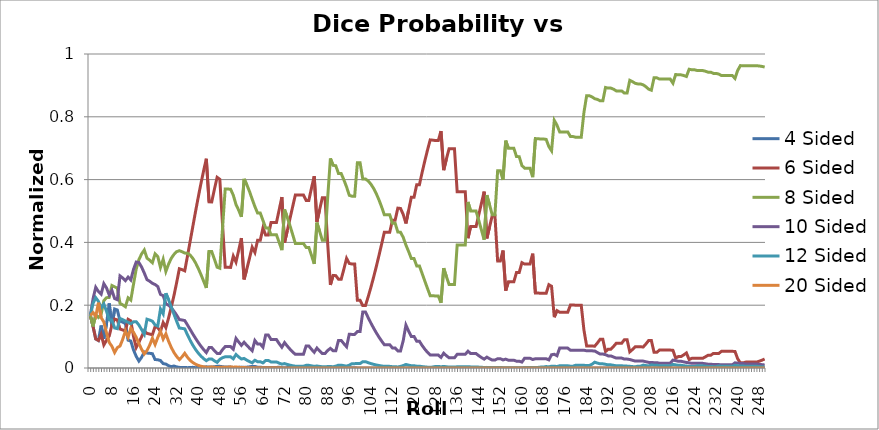
| Category | 4 Sided | 6 Sided | 8 Sided | 10 Sided | 12 Sided | 20 Sided |
|---|---|---|---|---|---|---|
| 0.0 | 0.167 | 0.167 | 0.167 | 0.167 | 0.167 | 0.167 |
| 1.0 | 0.132 | 0.132 | 0.132 | 0.221 | 0.206 | 0.176 |
| 2.0 | 0.093 | 0.093 | 0.17 | 0.257 | 0.224 | 0.164 |
| 3.0 | 0.088 | 0.088 | 0.161 | 0.244 | 0.212 | 0.208 |
| 4.0 | 0.135 | 0.107 | 0.171 | 0.235 | 0.191 | 0.16 |
| 5.0 | 0.093 | 0.073 | 0.215 | 0.269 | 0.204 | 0.147 |
| 6.0 | 0.141 | 0.088 | 0.224 | 0.255 | 0.181 | 0.111 |
| 7.0 | 0.206 | 0.102 | 0.225 | 0.233 | 0.154 | 0.081 |
| 8.0 | 0.131 | 0.137 | 0.263 | 0.247 | 0.152 | 0.069 |
| 9.0 | 0.188 | 0.156 | 0.259 | 0.221 | 0.127 | 0.049 |
| 10.0 | 0.185 | 0.153 | 0.254 | 0.218 | 0.125 | 0.065 |
| 11.0 | 0.149 | 0.124 | 0.206 | 0.293 | 0.158 | 0.07 |
| 12.0 | 0.146 | 0.121 | 0.201 | 0.287 | 0.154 | 0.091 |
| 13.0 | 0.142 | 0.118 | 0.195 | 0.278 | 0.149 | 0.118 |
| 14.0 | 0.089 | 0.155 | 0.223 | 0.29 | 0.145 | 0.098 |
| 15.0 | 0.086 | 0.15 | 0.216 | 0.28 | 0.141 | 0.127 |
| 16.0 | 0.058 | 0.101 | 0.267 | 0.314 | 0.147 | 0.114 |
| 17.0 | 0.037 | 0.065 | 0.315 | 0.337 | 0.147 | 0.098 |
| 18.0 | 0.022 | 0.082 | 0.345 | 0.336 | 0.137 | 0.078 |
| 19.0 | 0.034 | 0.099 | 0.363 | 0.321 | 0.122 | 0.06 |
| 20.0 | 0.051 | 0.118 | 0.376 | 0.302 | 0.107 | 0.045 |
| 21.0 | 0.048 | 0.11 | 0.35 | 0.281 | 0.156 | 0.056 |
| 22.0 | 0.047 | 0.108 | 0.343 | 0.276 | 0.153 | 0.073 |
| 23.0 | 0.046 | 0.106 | 0.335 | 0.27 | 0.149 | 0.095 |
| 24.0 | 0.027 | 0.132 | 0.363 | 0.266 | 0.137 | 0.075 |
| 25.0 | 0.026 | 0.129 | 0.355 | 0.259 | 0.134 | 0.097 |
| 26.0 | 0.024 | 0.116 | 0.32 | 0.234 | 0.188 | 0.117 |
| 27.0 | 0.014 | 0.145 | 0.346 | 0.23 | 0.172 | 0.092 |
| 28.0 | 0.012 | 0.128 | 0.307 | 0.204 | 0.238 | 0.109 |
| 29.0 | 0.007 | 0.159 | 0.331 | 0.2 | 0.217 | 0.085 |
| 30.0 | 0.004 | 0.194 | 0.35 | 0.192 | 0.195 | 0.066 |
| 31.0 | 0.006 | 0.231 | 0.362 | 0.181 | 0.171 | 0.049 |
| 32.0 | 0.004 | 0.272 | 0.37 | 0.168 | 0.149 | 0.037 |
| 33.0 | 0.002 | 0.316 | 0.374 | 0.154 | 0.127 | 0.027 |
| 34.0 | 0.002 | 0.313 | 0.37 | 0.153 | 0.126 | 0.036 |
| 35.0 | 0.002 | 0.31 | 0.366 | 0.151 | 0.125 | 0.047 |
| 36.0 | 0.001 | 0.356 | 0.366 | 0.137 | 0.106 | 0.034 |
| 37.0 | 0.001 | 0.403 | 0.36 | 0.123 | 0.088 | 0.024 |
| 38.0 | 0.002 | 0.451 | 0.349 | 0.108 | 0.073 | 0.017 |
| 39.0 | 0.001 | 0.498 | 0.335 | 0.094 | 0.059 | 0.012 |
| 40.0 | 0.002 | 0.544 | 0.317 | 0.081 | 0.048 | 0.008 |
| 41.0 | 0.002 | 0.587 | 0.298 | 0.069 | 0.038 | 0.006 |
| 42.0 | 0.003 | 0.628 | 0.277 | 0.059 | 0.03 | 0.004 |
| 43.0 | 0.004 | 0.666 | 0.255 | 0.049 | 0.023 | 0.003 |
| 44.0 | 0.003 | 0.529 | 0.371 | 0.065 | 0.029 | 0.003 |
| 45.0 | 0.003 | 0.529 | 0.371 | 0.065 | 0.029 | 0.004 |
| 46.0 | 0.004 | 0.569 | 0.346 | 0.055 | 0.023 | 0.002 |
| 47.0 | 0.005 | 0.607 | 0.321 | 0.046 | 0.018 | 0.002 |
| 48.0 | 0.005 | 0.601 | 0.318 | 0.046 | 0.028 | 0.002 |
| 49.0 | 0.004 | 0.458 | 0.444 | 0.058 | 0.033 | 0.002 |
| 50.0 | 0.003 | 0.321 | 0.57 | 0.068 | 0.036 | 0.002 |
| 51.0 | 0.003 | 0.321 | 0.57 | 0.068 | 0.036 | 0.003 |
| 52.0 | 0.003 | 0.32 | 0.569 | 0.068 | 0.036 | 0.004 |
| 53.0 | 0.002 | 0.357 | 0.55 | 0.06 | 0.029 | 0.003 |
| 54.0 | 0.001 | 0.337 | 0.521 | 0.094 | 0.043 | 0.003 |
| 55.0 | 0.002 | 0.375 | 0.503 | 0.083 | 0.035 | 0.002 |
| 56.0 | 0.003 | 0.414 | 0.481 | 0.072 | 0.029 | 0.002 |
| 57.0 | 0.002 | 0.282 | 0.602 | 0.082 | 0.03 | 0.001 |
| 58.0 | 0.003 | 0.315 | 0.584 | 0.072 | 0.025 | 0.001 |
| 59.0 | 0.004 | 0.349 | 0.562 | 0.063 | 0.02 | 0.001 |
| 60.0 | 0.005 | 0.385 | 0.538 | 0.055 | 0.017 | 0 |
| 61.0 | 0.005 | 0.368 | 0.514 | 0.088 | 0.025 | 0.001 |
| 62.0 | 0.003 | 0.407 | 0.494 | 0.076 | 0.02 | 0 |
| 63.0 | 0.003 | 0.407 | 0.494 | 0.076 | 0.02 | 0.001 |
| 64.0 | 0.001 | 0.446 | 0.47 | 0.066 | 0.016 | 0 |
| 65.0 | 0.001 | 0.423 | 0.446 | 0.105 | 0.024 | 0.001 |
| 66.0 | 0.001 | 0.423 | 0.446 | 0.105 | 0.024 | 0.001 |
| 67.0 | 0.002 | 0.464 | 0.424 | 0.091 | 0.019 | 0 |
| 68.0 | 0.002 | 0.464 | 0.424 | 0.091 | 0.019 | 0.001 |
| 69.0 | 0.002 | 0.463 | 0.424 | 0.091 | 0.019 | 0.001 |
| 70.0 | 0.002 | 0.504 | 0.4 | 0.078 | 0.015 | 0.001 |
| 71.0 | 0.001 | 0.544 | 0.376 | 0.066 | 0.012 | 0 |
| 72.0 | 0.001 | 0.399 | 0.505 | 0.081 | 0.014 | 0 |
| 73.0 | 0.001 | 0.437 | 0.48 | 0.07 | 0.011 | 0 |
| 74.0 | 0.002 | 0.475 | 0.454 | 0.06 | 0.009 | 0 |
| 75.0 | 0.002 | 0.513 | 0.426 | 0.051 | 0.007 | 0 |
| 76.0 | 0.003 | 0.551 | 0.397 | 0.043 | 0.006 | 0 |
| 77.0 | 0.003 | 0.551 | 0.397 | 0.043 | 0.006 | 0 |
| 78.0 | 0.003 | 0.551 | 0.396 | 0.043 | 0.006 | 0 |
| 79.0 | 0.003 | 0.551 | 0.396 | 0.043 | 0.006 | 0 |
| 80.0 | 0.003 | 0.534 | 0.384 | 0.07 | 0.009 | 0 |
| 81.0 | 0.003 | 0.534 | 0.384 | 0.07 | 0.009 | 0 |
| 82.0 | 0.002 | 0.573 | 0.358 | 0.059 | 0.007 | 0 |
| 83.0 | 0.002 | 0.611 | 0.332 | 0.05 | 0.005 | 0 |
| 84.0 | 0.002 | 0.465 | 0.463 | 0.064 | 0.006 | 0 |
| 85.0 | 0.001 | 0.504 | 0.436 | 0.054 | 0.005 | 0 |
| 86.0 | 0.001 | 0.542 | 0.407 | 0.046 | 0.004 | 0 |
| 87.0 | 0.001 | 0.542 | 0.407 | 0.046 | 0.004 | 0 |
| 88.0 | 0.001 | 0.395 | 0.543 | 0.056 | 0.005 | 0 |
| 89.0 | 0.001 | 0.265 | 0.667 | 0.063 | 0.005 | 0 |
| 90.0 | 0.001 | 0.295 | 0.646 | 0.055 | 0.004 | 0 |
| 91.0 | 0.001 | 0.294 | 0.644 | 0.055 | 0.006 | 0 |
| 92.0 | 0.001 | 0.283 | 0.619 | 0.088 | 0.009 | 0 |
| 93.0 | 0.001 | 0.283 | 0.619 | 0.088 | 0.009 | 0 |
| 94.0 | 0.001 | 0.315 | 0.599 | 0.077 | 0.007 | 0 |
| 95.0 | 0.001 | 0.349 | 0.577 | 0.068 | 0.006 | 0 |
| 96.0 | 0.001 | 0.333 | 0.55 | 0.108 | 0.009 | 0 |
| 97.0 | 0.001 | 0.331 | 0.547 | 0.107 | 0.014 | 0 |
| 98.0 | 0.001 | 0.331 | 0.547 | 0.107 | 0.014 | 0 |
| 99.0 | 0 | 0.216 | 0.653 | 0.116 | 0.014 | 0 |
| 100.0 | 0 | 0.216 | 0.653 | 0.116 | 0.014 | 0 |
| 101.0 | 0 | 0.199 | 0.602 | 0.178 | 0.02 | 0 |
| 102.0 | 0 | 0.199 | 0.602 | 0.178 | 0.02 | 0 |
| 103.0 | 0 | 0.227 | 0.596 | 0.16 | 0.017 | 0 |
| 104.0 | 0 | 0.256 | 0.586 | 0.143 | 0.014 | 0 |
| 105.0 | 0 | 0.288 | 0.572 | 0.127 | 0.012 | 0 |
| 106.0 | 0 | 0.322 | 0.555 | 0.112 | 0.01 | 0 |
| 107.0 | 0 | 0.358 | 0.535 | 0.099 | 0.008 | 0 |
| 108.0 | 0 | 0.395 | 0.513 | 0.086 | 0.006 | 0 |
| 109.0 | 0 | 0.433 | 0.488 | 0.074 | 0.005 | 0 |
| 110.0 | 0 | 0.433 | 0.488 | 0.074 | 0.005 | 0 |
| 111.0 | 0 | 0.433 | 0.488 | 0.074 | 0.005 | 0 |
| 112.0 | 0 | 0.471 | 0.461 | 0.064 | 0.004 | 0 |
| 113.0 | 0 | 0.471 | 0.461 | 0.064 | 0.004 | 0 |
| 114.0 | 0 | 0.509 | 0.433 | 0.054 | 0.003 | 0 |
| 115.0 | 0 | 0.508 | 0.432 | 0.054 | 0.005 | 0 |
| 116.0 | 0 | 0.489 | 0.416 | 0.087 | 0.008 | 0 |
| 117.0 | 0 | 0.46 | 0.392 | 0.137 | 0.011 | 0 |
| 118.0 | 0 | 0.502 | 0.371 | 0.118 | 0.009 | 0 |
| 119.0 | 0 | 0.543 | 0.349 | 0.101 | 0.007 | 0 |
| 120.0 | 0 | 0.543 | 0.349 | 0.101 | 0.007 | 0 |
| 121.0 | 0 | 0.584 | 0.325 | 0.085 | 0.006 | 0 |
| 122.0 | 0 | 0.584 | 0.325 | 0.085 | 0.006 | 0 |
| 123.0 | 0 | 0.622 | 0.301 | 0.072 | 0.004 | 0 |
| 124.0 | 0 | 0.659 | 0.277 | 0.06 | 0.004 | 0 |
| 125.0 | 0 | 0.694 | 0.253 | 0.05 | 0.003 | 0 |
| 126.0 | 0 | 0.726 | 0.23 | 0.041 | 0.002 | 0 |
| 127.0 | 0 | 0.726 | 0.23 | 0.041 | 0.003 | 0 |
| 128.0 | 0 | 0.724 | 0.23 | 0.041 | 0.005 | 0 |
| 129.0 | 0 | 0.724 | 0.229 | 0.041 | 0.005 | 0 |
| 130.0 | 0 | 0.755 | 0.208 | 0.034 | 0.004 | 0 |
| 131.0 | 0 | 0.63 | 0.318 | 0.047 | 0.005 | 0 |
| 132.0 | 0 | 0.665 | 0.291 | 0.039 | 0.004 | 0 |
| 133.0 | 0 | 0.699 | 0.266 | 0.033 | 0.003 | 0 |
| 134.0 | 0 | 0.699 | 0.266 | 0.033 | 0.003 | 0 |
| 135.0 | 0 | 0.699 | 0.266 | 0.033 | 0.003 | 0 |
| 136.0 | 0 | 0.561 | 0.391 | 0.044 | 0.004 | 0 |
| 137.0 | 0 | 0.561 | 0.391 | 0.044 | 0.004 | 0 |
| 138.0 | 0 | 0.561 | 0.391 | 0.044 | 0.004 | 0 |
| 139.0 | 0 | 0.561 | 0.391 | 0.044 | 0.004 | 0 |
| 140.0 | 0 | 0.413 | 0.529 | 0.053 | 0.004 | 0 |
| 141.0 | 0 | 0.45 | 0.5 | 0.046 | 0.003 | 0 |
| 142.0 | 0 | 0.45 | 0.5 | 0.046 | 0.003 | 0 |
| 143.0 | 0 | 0.45 | 0.5 | 0.046 | 0.003 | 0 |
| 144.0 | 0 | 0.488 | 0.47 | 0.039 | 0.003 | 0 |
| 145.0 | 0 | 0.525 | 0.44 | 0.033 | 0.002 | 0 |
| 146.0 | 0 | 0.562 | 0.408 | 0.028 | 0.002 | 0 |
| 147.0 | 0 | 0.413 | 0.551 | 0.035 | 0.002 | 0 |
| 148.0 | 0 | 0.449 | 0.52 | 0.03 | 0.002 | 0 |
| 149.0 | 0 | 0.485 | 0.488 | 0.025 | 0.001 | 0 |
| 150.0 | 0 | 0.485 | 0.488 | 0.025 | 0.001 | 0 |
| 151.0 | 0 | 0.341 | 0.628 | 0.03 | 0.001 | 0 |
| 152.0 | 0 | 0.341 | 0.628 | 0.03 | 0.001 | 0 |
| 153.0 | 0 | 0.374 | 0.599 | 0.026 | 0.001 | 0 |
| 154.0 | 0 | 0.247 | 0.724 | 0.028 | 0.001 | 0 |
| 155.0 | 0 | 0.275 | 0.7 | 0.025 | 0.001 | 0 |
| 156.0 | 0 | 0.275 | 0.7 | 0.025 | 0.001 | 0 |
| 157.0 | 0 | 0.275 | 0.7 | 0.025 | 0.001 | 0 |
| 158.0 | 0 | 0.304 | 0.673 | 0.022 | 0.001 | 0 |
| 159.0 | 0 | 0.304 | 0.673 | 0.022 | 0.001 | 0 |
| 160.0 | 0 | 0.335 | 0.645 | 0.019 | 0.001 | 0 |
| 161.0 | 0 | 0.331 | 0.636 | 0.031 | 0.001 | 0 |
| 162.0 | 0 | 0.331 | 0.636 | 0.031 | 0.001 | 0 |
| 163.0 | 0 | 0.331 | 0.636 | 0.031 | 0.001 | 0 |
| 164.0 | 0 | 0.364 | 0.608 | 0.027 | 0.001 | 0 |
| 165.0 | 0 | 0.239 | 0.731 | 0.029 | 0.001 | 0 |
| 166.0 | 0 | 0.239 | 0.73 | 0.029 | 0.002 | 0 |
| 167.0 | 0 | 0.238 | 0.729 | 0.029 | 0.003 | 0 |
| 168.0 | 0 | 0.238 | 0.729 | 0.029 | 0.003 | 0 |
| 169.0 | 0 | 0.238 | 0.728 | 0.029 | 0.005 | 0 |
| 170.0 | 0 | 0.265 | 0.705 | 0.026 | 0.004 | 0 |
| 171.0 | 0 | 0.26 | 0.692 | 0.042 | 0.006 | 0 |
| 172.0 | 0 | 0.162 | 0.789 | 0.044 | 0.006 | 0 |
| 173.0 | 0 | 0.183 | 0.773 | 0.039 | 0.005 | 0 |
| 174.0 | 0 | 0.178 | 0.752 | 0.063 | 0.007 | 0 |
| 175.0 | 0 | 0.178 | 0.752 | 0.063 | 0.007 | 0 |
| 176.0 | 0 | 0.178 | 0.752 | 0.063 | 0.007 | 0 |
| 177.0 | 0 | 0.178 | 0.752 | 0.063 | 0.007 | 0 |
| 178.0 | 0 | 0.201 | 0.737 | 0.056 | 0.006 | 0 |
| 179.0 | 0 | 0.201 | 0.737 | 0.056 | 0.006 | 0 |
| 180.0 | 0 | 0.2 | 0.735 | 0.056 | 0.009 | 0 |
| 181.0 | 0 | 0.2 | 0.735 | 0.056 | 0.009 | 0 |
| 182.0 | 0 | 0.2 | 0.735 | 0.056 | 0.009 | 0 |
| 183.0 | 0 | 0.121 | 0.814 | 0.057 | 0.009 | 0 |
| 184.0 | 0 | 0.07 | 0.867 | 0.055 | 0.008 | 0 |
| 185.0 | 0 | 0.07 | 0.867 | 0.055 | 0.008 | 0 |
| 186.0 | 0 | 0.07 | 0.863 | 0.055 | 0.012 | 0 |
| 187.0 | 0 | 0.069 | 0.858 | 0.054 | 0.019 | 0 |
| 188.0 | 0 | 0.08 | 0.855 | 0.049 | 0.016 | 0 |
| 189.0 | 0 | 0.091 | 0.851 | 0.044 | 0.013 | 0 |
| 190.0 | 0 | 0.091 | 0.851 | 0.044 | 0.013 | 0 |
| 191.0 | 0 | 0.052 | 0.893 | 0.042 | 0.012 | 0 |
| 192.0 | 0 | 0.06 | 0.891 | 0.039 | 0.01 | 0 |
| 193.0 | 0 | 0.06 | 0.891 | 0.039 | 0.01 | 0 |
| 194.0 | 0 | 0.069 | 0.888 | 0.035 | 0.008 | 0 |
| 195.0 | 0 | 0.079 | 0.882 | 0.032 | 0.007 | 0 |
| 196.0 | 0 | 0.079 | 0.882 | 0.032 | 0.007 | 0 |
| 197.0 | 0 | 0.079 | 0.882 | 0.032 | 0.007 | 0 |
| 198.0 | 0 | 0.09 | 0.875 | 0.028 | 0.006 | 0 |
| 199.0 | 0 | 0.09 | 0.875 | 0.028 | 0.006 | 0 |
| 200.0 | 0 | 0.051 | 0.916 | 0.027 | 0.005 | 0 |
| 201.0 | 0 | 0.059 | 0.912 | 0.024 | 0.005 | 0 |
| 202.0 | 0 | 0.068 | 0.907 | 0.022 | 0.004 | 0 |
| 203.0 | 0 | 0.067 | 0.905 | 0.022 | 0.006 | 0 |
| 204.0 | 0 | 0.067 | 0.905 | 0.022 | 0.006 | 0 |
| 205.0 | 0 | 0.067 | 0.902 | 0.022 | 0.009 | 0 |
| 206.0 | 0 | 0.077 | 0.896 | 0.02 | 0.008 | 0 |
| 207.0 | 0 | 0.088 | 0.888 | 0.018 | 0.006 | 0 |
| 208.0 | 0 | 0.087 | 0.885 | 0.018 | 0.01 | 0 |
| 209.0 | 0 | 0.05 | 0.924 | 0.017 | 0.009 | 0 |
| 210.0 | 0 | 0.05 | 0.924 | 0.017 | 0.009 | 0 |
| 211.0 | 0 | 0.057 | 0.92 | 0.015 | 0.008 | 0 |
| 212.0 | 0 | 0.057 | 0.92 | 0.015 | 0.008 | 0 |
| 213.0 | 0 | 0.057 | 0.92 | 0.015 | 0.008 | 0 |
| 214.0 | 0 | 0.057 | 0.92 | 0.015 | 0.008 | 0 |
| 215.0 | 0 | 0.057 | 0.92 | 0.015 | 0.008 | 0 |
| 216.0 | 0 | 0.056 | 0.907 | 0.025 | 0.012 | 0 |
| 217.0 | 0 | 0.032 | 0.935 | 0.024 | 0.01 | 0 |
| 218.0 | 0 | 0.036 | 0.934 | 0.021 | 0.009 | 0 |
| 219.0 | 0 | 0.036 | 0.934 | 0.021 | 0.009 | 0 |
| 220.0 | 0 | 0.042 | 0.932 | 0.019 | 0.007 | 0 |
| 221.0 | 0 | 0.048 | 0.928 | 0.018 | 0.006 | 0 |
| 222.0 | 0 | 0.027 | 0.951 | 0.016 | 0.005 | 0 |
| 223.0 | 0 | 0.031 | 0.95 | 0.015 | 0.005 | 0 |
| 224.0 | 0 | 0.031 | 0.95 | 0.015 | 0.005 | 0 |
| 225.0 | 0 | 0.031 | 0.947 | 0.015 | 0.007 | 0 |
| 226.0 | 0 | 0.031 | 0.947 | 0.015 | 0.007 | 0 |
| 227.0 | 0 | 0.031 | 0.947 | 0.015 | 0.007 | 0 |
| 228.0 | 0 | 0.035 | 0.945 | 0.013 | 0.006 | 0 |
| 229.0 | 0 | 0.041 | 0.942 | 0.012 | 0.005 | 0 |
| 230.0 | 0 | 0.041 | 0.942 | 0.012 | 0.005 | 0 |
| 231.0 | 0 | 0.046 | 0.938 | 0.011 | 0.004 | 0 |
| 232.0 | 0 | 0.046 | 0.938 | 0.011 | 0.004 | 0 |
| 233.0 | 0 | 0.046 | 0.936 | 0.011 | 0.007 | 0 |
| 234.0 | 0 | 0.053 | 0.931 | 0.01 | 0.006 | 0 |
| 235.0 | 0 | 0.053 | 0.931 | 0.01 | 0.006 | 0 |
| 236.0 | 0 | 0.053 | 0.931 | 0.01 | 0.006 | 0 |
| 237.0 | 0 | 0.053 | 0.931 | 0.01 | 0.006 | 0 |
| 238.0 | 0 | 0.053 | 0.931 | 0.01 | 0.006 | 0 |
| 239.0 | 0 | 0.053 | 0.922 | 0.016 | 0.009 | 0 |
| 240.0 | 0 | 0.029 | 0.948 | 0.015 | 0.007 | 0 |
| 241.0 | 0 | 0.016 | 0.963 | 0.014 | 0.006 | 0 |
| 242.0 | 0 | 0.016 | 0.963 | 0.014 | 0.006 | 0 |
| 243.0 | 0 | 0.019 | 0.963 | 0.013 | 0.005 | 0 |
| 244.0 | 0 | 0.019 | 0.963 | 0.013 | 0.005 | 0 |
| 245.0 | 0 | 0.019 | 0.963 | 0.013 | 0.005 | 0 |
| 246.0 | 0 | 0.019 | 0.963 | 0.013 | 0.005 | 0 |
| 247.0 | 0 | 0.019 | 0.963 | 0.013 | 0.005 | 0 |
| 248.0 | 0 | 0.022 | 0.962 | 0.012 | 0.005 | 0 |
| 249.0 | 0 | 0.025 | 0.96 | 0.011 | 0.004 | 0 |
| 250.0 | 0 | 0.029 | 0.958 | 0.01 | 0.003 | 0 |